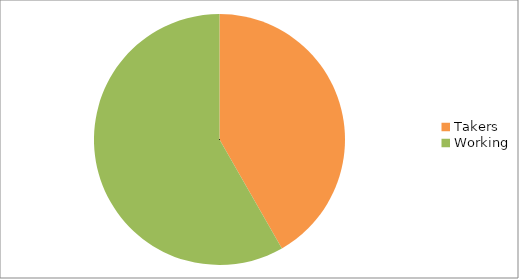
| Category | Series 0 |
|---|---|
| Takers | 0.417 |
| Working | 0.583 |